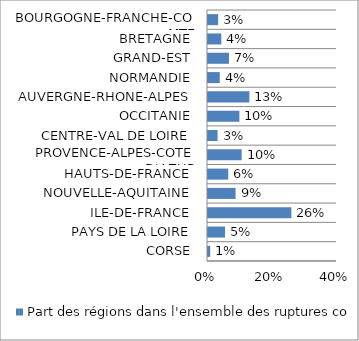
| Category | Part des régions dans l'ensemble des ruptures conventionnelles en 2019 |
|---|---|
| CORSE | 0.007 |
| PAYS DE LA LOIRE | 0.053 |
| ILE-DE-FRANCE | 0.259 |
| NOUVELLE-AQUITAINE | 0.085 |
| HAUTS-DE-FRANCE | 0.063 |
| PROVENCE-ALPES-COTE D'AZUR | 0.104 |
| CENTRE-VAL DE LOIRE | 0.03 |
| OCCITANIE | 0.097 |
| AUVERGNE-RHONE-ALPES | 0.128 |
| NORMANDIE | 0.036 |
| GRAND-EST | 0.065 |
| BRETAGNE | 0.041 |
| BOURGOGNE-FRANCHE-COMTE | 0.031 |